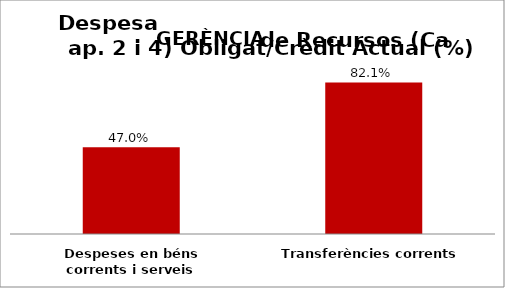
| Category | Series 0 |
|---|---|
| Despeses en béns corrents i serveis | 0.47 |
| Transferències corrents | 0.821 |